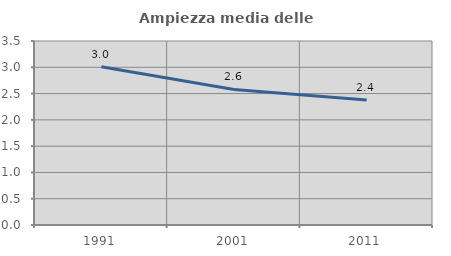
| Category | Ampiezza media delle famiglie |
|---|---|
| 1991.0 | 3.009 |
| 2001.0 | 2.578 |
| 2011.0 | 2.376 |